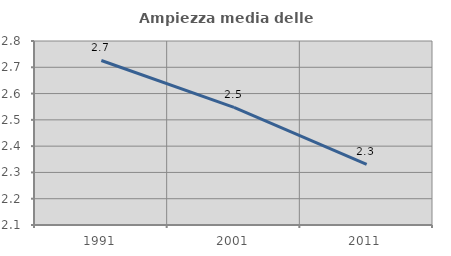
| Category | Ampiezza media delle famiglie |
|---|---|
| 1991.0 | 2.726 |
| 2001.0 | 2.548 |
| 2011.0 | 2.33 |